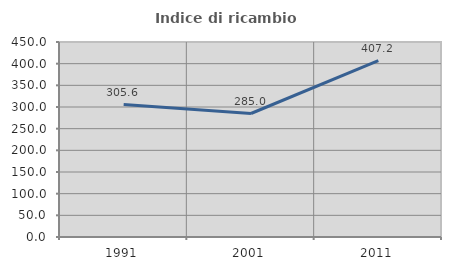
| Category | Indice di ricambio occupazionale  |
|---|---|
| 1991.0 | 305.618 |
| 2001.0 | 285 |
| 2011.0 | 407.246 |